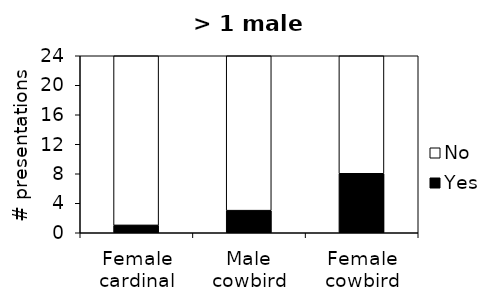
| Category | Yes | No |
|---|---|---|
| Female cardinal | 1 | 24 |
| Male cowbird | 3 | 22 |
| Female cowbird | 8 | 17 |